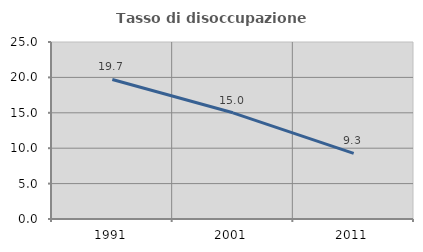
| Category | Tasso di disoccupazione giovanile  |
|---|---|
| 1991.0 | 19.704 |
| 2001.0 | 15 |
| 2011.0 | 9.278 |